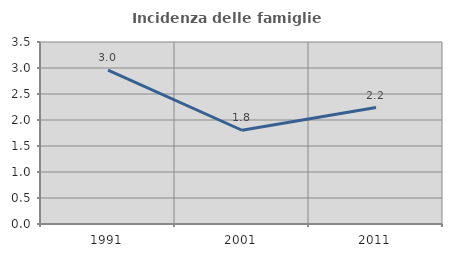
| Category | Incidenza delle famiglie numerose |
|---|---|
| 1991.0 | 2.961 |
| 2001.0 | 1.803 |
| 2011.0 | 2.239 |